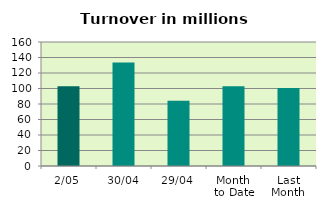
| Category | Series 0 |
|---|---|
| 2/05 | 102.923 |
| 30/04 | 133.503 |
| 29/04 | 84.049 |
| Month 
to Date | 102.923 |
| Last
Month | 100.792 |